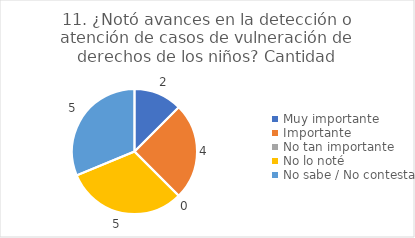
| Category | 11. ¿Notó avances en la detección o atención de casos de vulneración de derechos de los niños? |
|---|---|
| Muy importante  | 0.125 |
| Importante  | 0.25 |
| No tan importante  | 0 |
| No lo noté  | 0.312 |
| No sabe / No contesta | 0.312 |